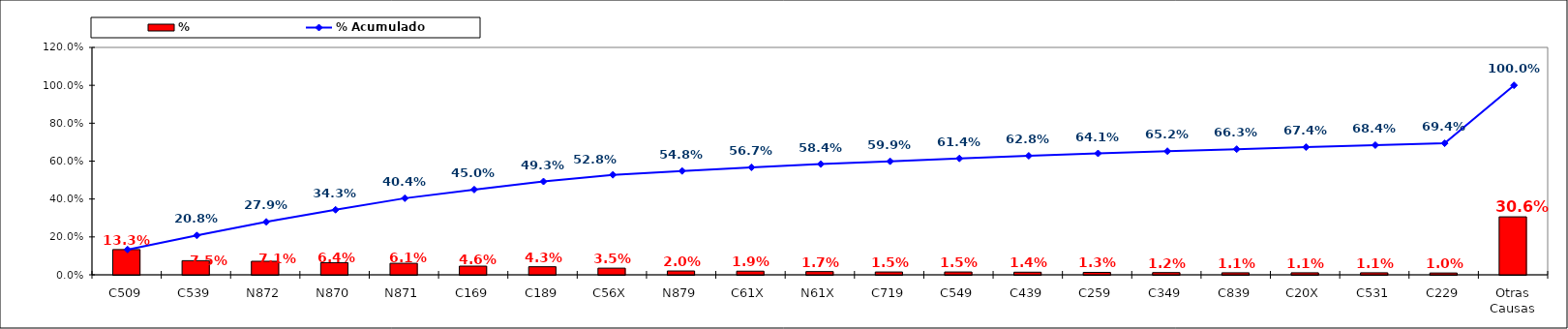
| Category | % |
|---|---|
| C509 | 0.133 |
| C539 | 0.075 |
| N872 | 0.071 |
| N870 | 0.064 |
| N871 | 0.061 |
| C169 | 0.046 |
| C189 | 0.043 |
| C56X | 0.035 |
| N879 | 0.02 |
| C61X | 0.019 |
| N61X | 0.017 |
| C719 | 0.015 |
| C549 | 0.015 |
| C439 | 0.014 |
| C259 | 0.013 |
| C349 | 0.012 |
| C839 | 0.011 |
| C20X | 0.011 |
| C531 | 0.011 |
| C229 | 0.01 |
| Otras Causas | 0.306 |